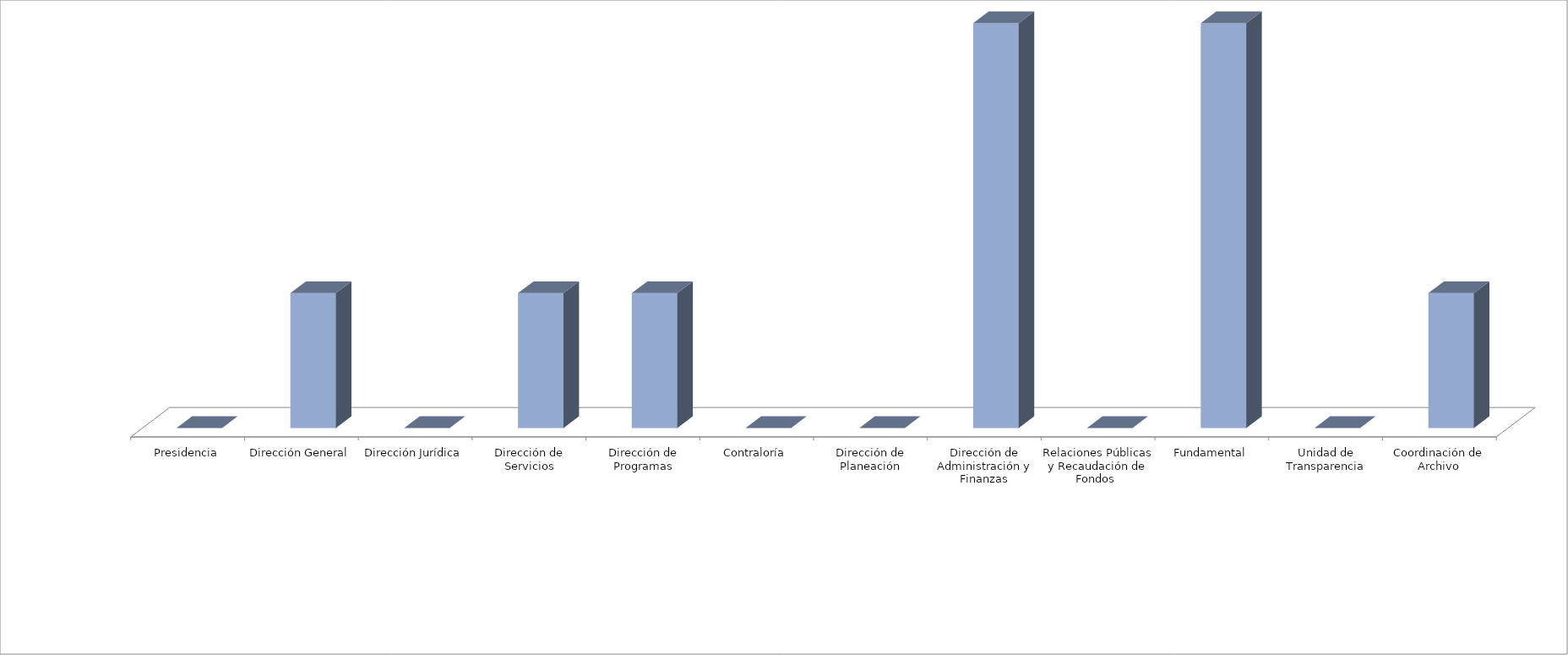
| Category | Series 0 | Series 1 |
|---|---|---|
| Presidencia |  | 0 |
| Dirección General |  | 1 |
| Dirección Jurídica |  | 0 |
| Dirección de Servicios |  | 1 |
| Dirección de Programas |  | 1 |
| Contraloría |  | 0 |
| Dirección de Planeación |  | 0 |
| Dirección de Administración y Finanzas |  | 3 |
| Relaciones Públicas y Recaudación de Fondos  |  | 0 |
| Fundamental |  | 3 |
| Unidad de Transparencia |  | 0 |
| Coordinación de Archivo |  | 1 |